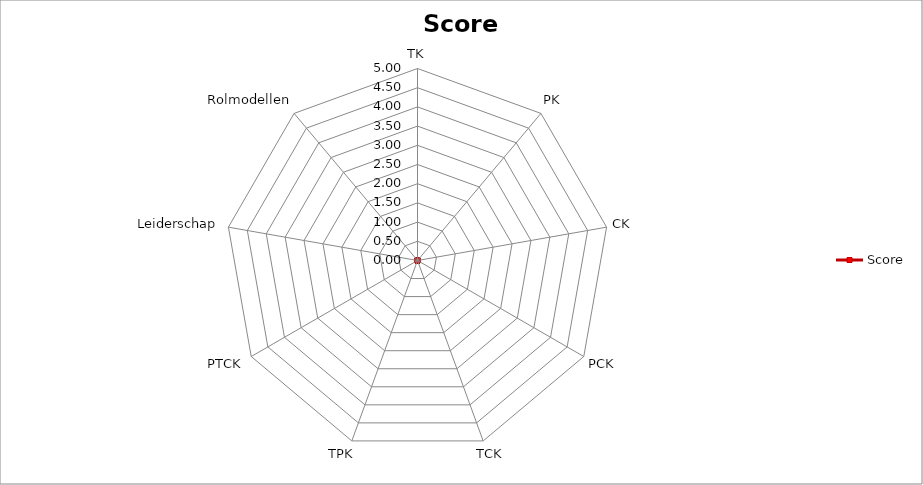
| Category | Score |
|---|---|
| TK | 0 |
| PK | 0 |
| CK | 0 |
| PCK | 0 |
| TCK | 0 |
| TPK | 0 |
| PTCK | 0 |
| Leiderschap | 0 |
| Rolmodellen | 0 |